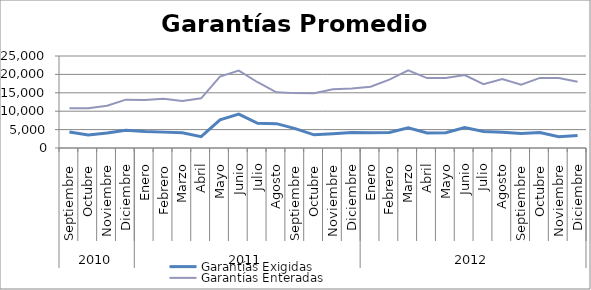
| Category | Garantías Exigidas | Garantías Enteradas |
|---|---|---|
| 0 | 4372.607 | 10829.062 |
| 1 | 3557.93 | 10787.9 |
| 2 | 4056.528 | 11463.422 |
| 3 | 4832.111 | 13142.881 |
| 4 | 4466.32 | 13061.162 |
| 5 | 4313.718 | 13357.444 |
| 6 | 4162.491 | 12796.251 |
| 7 | 3090.395 | 13495.263 |
| 8 | 7655.186 | 19416.342 |
| 9 | 9198.096 | 21035.301 |
| 10 | 6699.851 | 17866.843 |
| 11 | 6615.292 | 15119.839 |
| 12 | 5266.973 | 14911.639 |
| 13 | 3572.137 | 14861.465 |
| 14 | 3876.388 | 15976.819 |
| 15 | 4182.413 | 16147.351 |
| 16 | 4146.8 | 16662.483 |
| 17 | 4190.531 | 18572.749 |
| 18 | 5482.211 | 21128.648 |
| 19 | 4079.038 | 18997.51 |
| 20 | 4141.554 | 19005.364 |
| 21 | 5549.139 | 19818.91 |
| 22 | 4487.023 | 17351.39 |
| 23 | 4277.924 | 18719.955 |
| 24 | 3940.893 | 17217.403 |
| 25 | 4180.69 | 19046.939 |
| 26 | 3056.997 | 19028.425 |
| 27 | 3426.799 | 17994.819 |